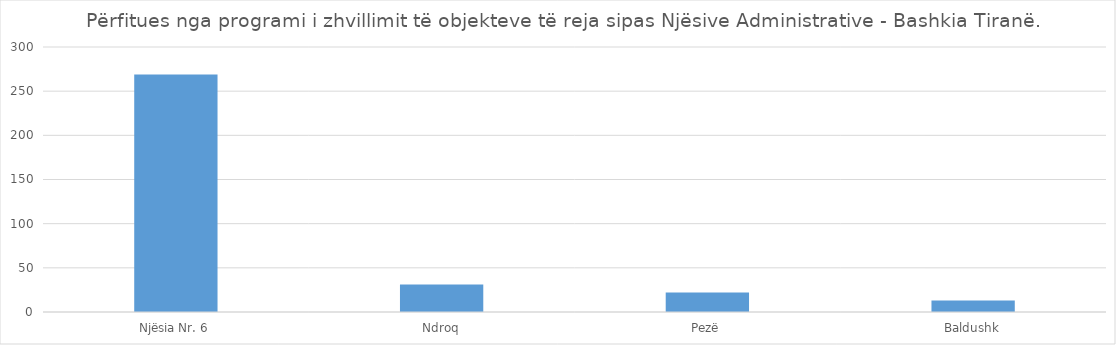
| Category | Nr. i Subjekteve Përfitues |
|---|---|
| Njësia Nr. 6 | 269 |
| Ndroq | 31 |
| Pezë | 22 |
| Baldushk | 13 |